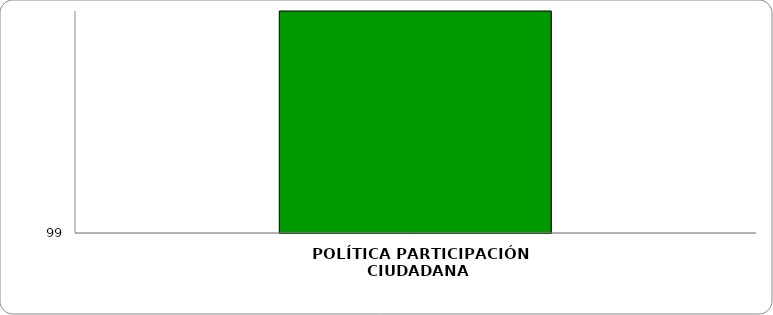
| Category | Niveles |
|---|---|
| POLÍTICA PARTICIPACIÓN CIUDADANA | 100 |